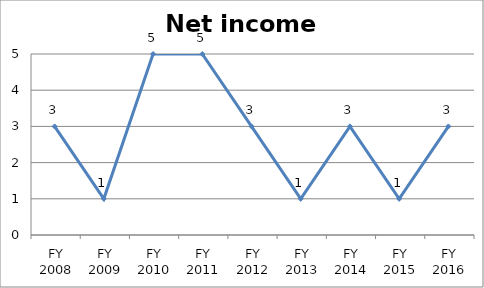
| Category | Net income score |
|---|---|
| FY 2016 | 3 |
| FY 2015 | 1 |
| FY 2014 | 3 |
| FY 2013 | 1 |
| FY 2012 | 3 |
| FY 2011 | 5 |
| FY 2010 | 5 |
| FY 2009 | 1 |
| FY 2008 | 3 |